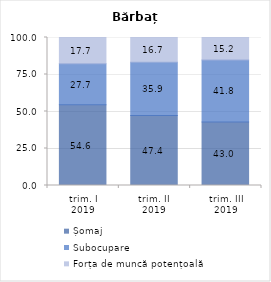
| Category | Șomaj | Subocupare | Forța de muncă potențoală |
|---|---|---|---|
| trim. I
2019 | 54.579 | 27.739 | 17.682 |
| trim. II
2019 | 47.357 | 35.946 | 16.698 |
| trim. III
2019 | 42.974 | 41.812 | 15.214 |